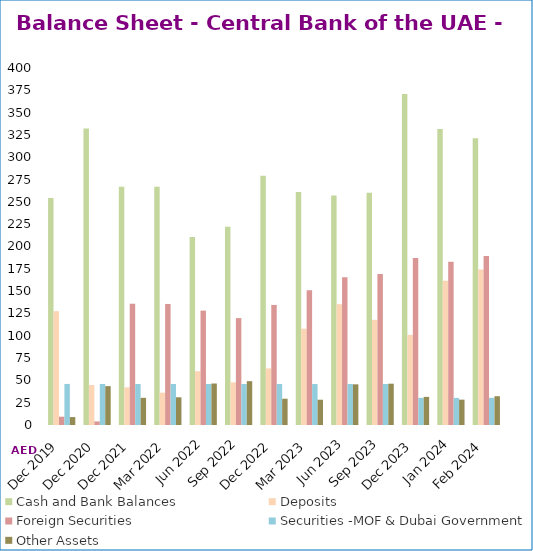
| Category | Cash and Bank Balances | Deposits |  Foreign Securities  |  Securities -MOF & Dubai Government | Other Assets |
|---|---|---|---|---|---|
| Dec 2019 | 254466 | 127591 | 9294 | 46018 | 8877 |
| Dec 2020 | 332251 | 44802 | 4012 | 45902 | 43559 |
| Dec 2021 | 267074 | 42230 | 135875 | 45903 | 30456 |
| Mar 2022 | 267039 | 36170 | 135624 | 45903 | 31057 |
| Jun 2022 | 210659 | 60230 | 128133 | 45903 | 46488 |
| Sep 2022 | 222056 | 47794 | 119763 | 45903 | 49117 |
| Dec 2022 | 279252 | 63425 | 134543 | 45902 | 29433 |
| Mar 2023 | 261163 | 107821 | 150917 | 45902 | 28312 |
| Jun 2023 | 257197 | 135343 | 165420 | 45902 | 45561 |
| Sep 2023 | 260339 | 117812 | 169242 | 45902 | 46279 |
| Dec 2023 | 370938 | 100957 | 187168 | 30379 | 31502 |
| Jan 2024 | 331536 | 161510 | 182786 | 30379 | 28399 |
| Feb 2024 | 321337 | 174269 | 189369 | 30379 | 32266 |